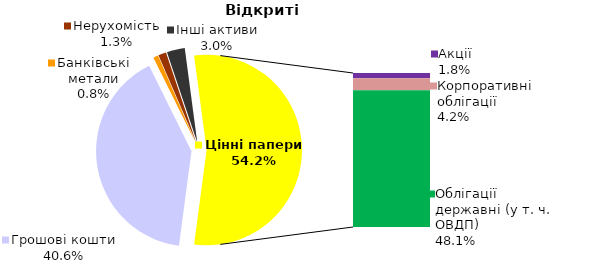
| Category | Відкриті |
|---|---|
| Грошові кошти | 776.311 |
| Банківські метали | 16.052 |
| Нерухомість | 25.604 |
| Інші активи | 58.346 |
| Акції | 35.284 |
| Корпоративні облігації | 80.191 |
| Облігації місцевих рад | 0.767 |
| Облігації державні (у т. ч. ОВДП) | 920.585 |